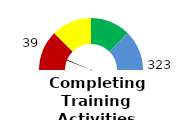
| Category | Series 1 |
|---|---|
| 0 | 12.074 |
| 1 | 1 |
| 2 | 186.926 |